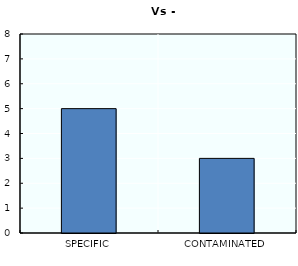
| Category | Series 0 |
|---|---|
| SPECIFIC | 5 |
| CONTAMINATED | 3 |